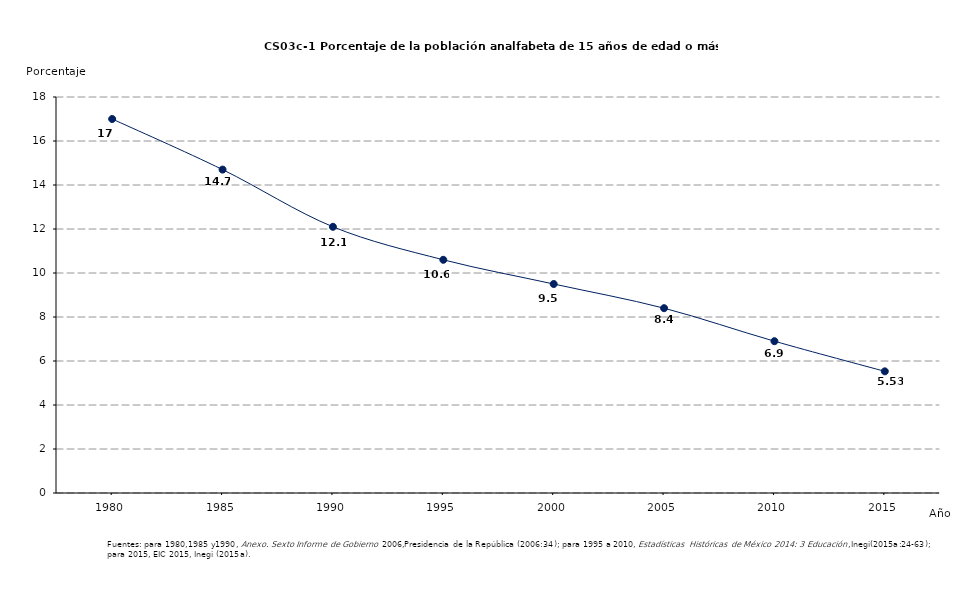
| Category | Series 0 |
|---|---|
| 1980.0 | 17 |
| 1985.0 | 14.7 |
| 1990.0 | 12.1 |
| 1995.0 | 10.6 |
| 2000.0 | 9.5 |
| 2005.0 | 8.4 |
| 2010.0 | 6.9 |
| 2015.0 | 5.53 |